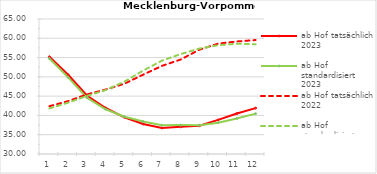
| Category | ab Hof tatsächlich 2023 | ab Hof standardisiert 2023 | ab Hof tatsächlich 2022 | ab Hof standardisiert 2022 |
|---|---|---|---|---|
| 0 | 55.208 | 54.75 | 42.392 | 41.81 |
| 1 | 50.53 | 49.867 | 43.71 | 43.313 |
| 2 | 45.16 | 44.609 | 45.443 | 45.057 |
| 3 | 41.921 | 41.594 | 46.711 | 46.567 |
| 4 | 39.514 | 39.668 | 48.22 | 48.747 |
| 5 | 37.773 | 38.418 | 50.572 | 51.619 |
| 6 | 36.755 | 37.473 | 52.837 | 54.194 |
| 7 | 37.061 | 37.488 | 54.495 | 55.911 |
| 8 | 37.328 | 37.472 | 57.038 | 57.33 |
| 9 | 38.84 | 38.116 | 58.611 | 58.215 |
| 10 | 40.503 | 39.22 | 59.174 | 58.575 |
| 11 | 41.898 | 40.461 | 59.544 | 58.444 |